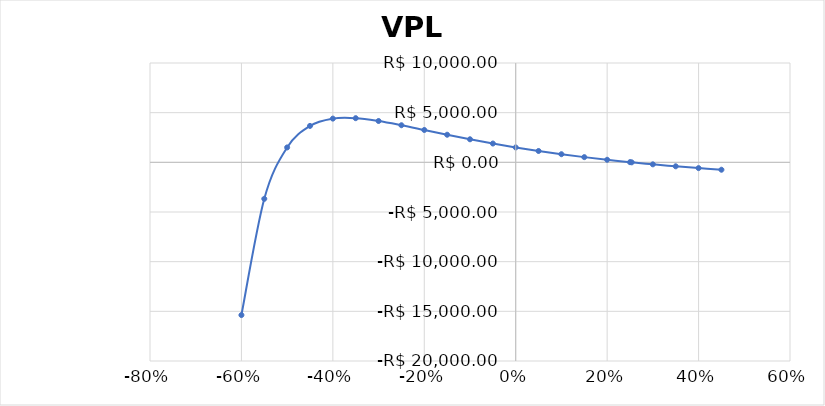
| Category | VPL |
|---|---|
| -0.6 | -15375 |
| -0.55 | -3672.23 |
| -0.5 | 1500 |
| -0.45 | 3666.86 |
| -0.4 | 4401.235 |
| -0.35 | 4444.75 |
| -0.3 | 4161.391 |
| -0.25 | 3734.568 |
| -0.2 | 3257.813 |
| -0.15 | 2778.541 |
| -0.1 | 2319.997 |
| -0.05 | 1892.607 |
| 0.0 | 1500 |
| 0.05 | 1142.253 |
| 0.1 | 817.67 |
| 0.15 | 523.749 |
| 0.2 | 257.716 |
| 0.25 | 16.8 |
| 0.253678 | -0.003 |
| 0.3 | -201.621 |
| 0.35 | -399.957 |
| 0.4 | -580.383 |
| 0.45 | -744.843 |